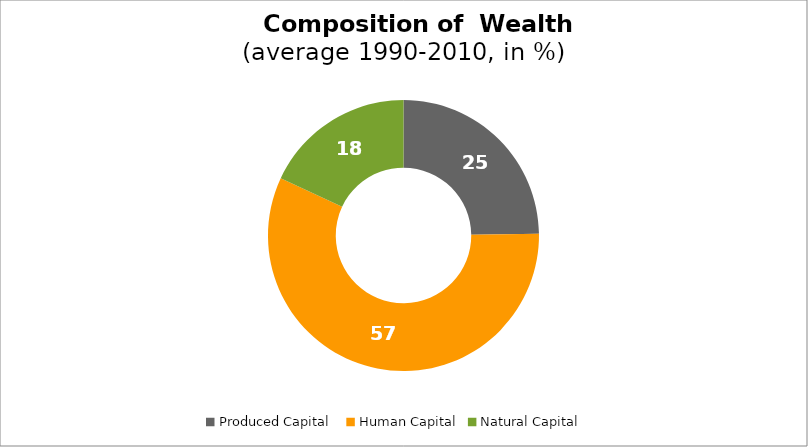
| Category | Series 0 |
|---|---|
| Produced Capital  | 24.806 |
| Human Capital | 57.143 |
| Natural Capital | 18.051 |